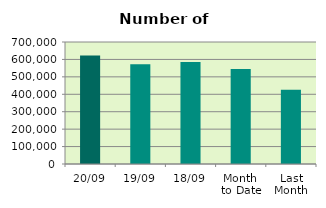
| Category | Series 0 |
|---|---|
| 20/09 | 622540 |
| 19/09 | 572408 |
| 18/09 | 585110 |
| Month 
to Date | 544870.571 |
| Last
Month | 425540 |